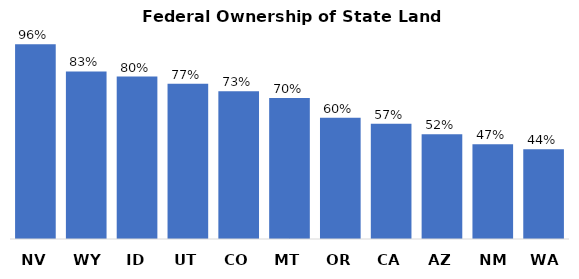
| Category | Federal |
|---|---|
| NV | 96.45 |
| WY | 82.95 |
| ID | 80.39 |
| UT | 76.91 |
| CO | 73.11 |
| MT | 69.81 |
| OR | 60.06 |
| CA | 57.08 |
| AZ | 51.85 |
| NM | 46.85 |
| WA | 44.39 |